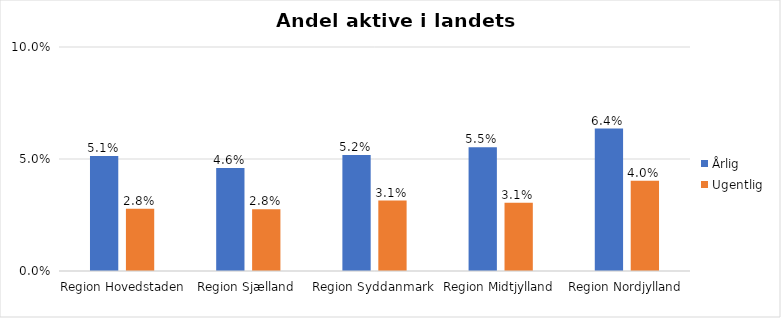
| Category | Årlig | Ugentlig |
|---|---|---|
| Region Hovedstaden | 0.051 | 0.028 |
| Region Sjælland | 0.046 | 0.028 |
| Region Syddanmark | 0.052 | 0.031 |
| Region Midtjylland | 0.055 | 0.031 |
| Region Nordjylland | 0.064 | 0.04 |